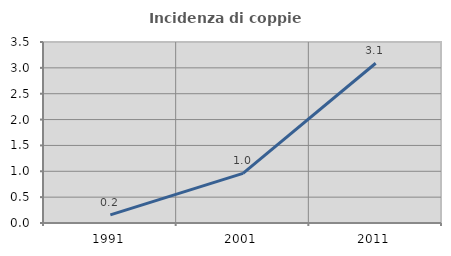
| Category | Incidenza di coppie miste |
|---|---|
| 1991.0 | 0.158 |
| 2001.0 | 0.96 |
| 2011.0 | 3.089 |